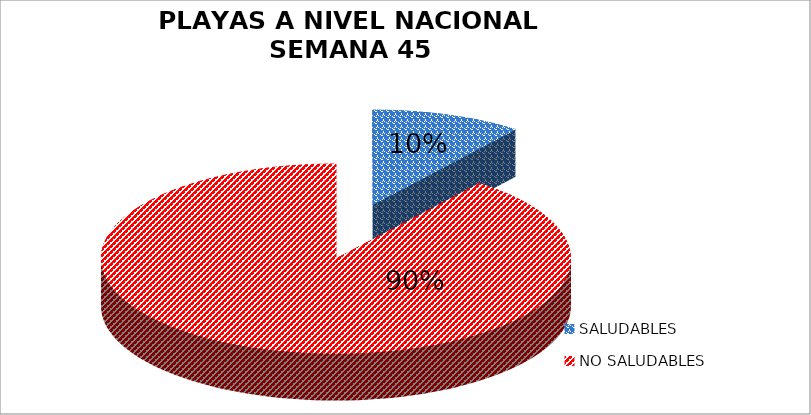
| Category | N.° |
|---|---|
| SALUDABLES | 16 |
| NO SALUDABLES | 138 |